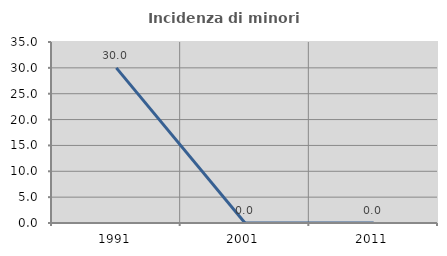
| Category | Incidenza di minori stranieri |
|---|---|
| 1991.0 | 30 |
| 2001.0 | 0 |
| 2011.0 | 0 |